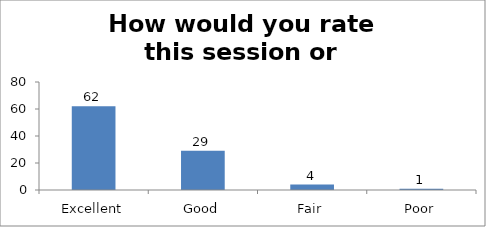
| Category | How would you rate this session or workshop? |
|---|---|
| Excellent | 62 |
| Good | 29 |
| Fair | 4 |
| Poor | 1 |